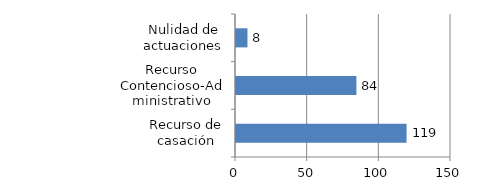
| Category | Series 0 |
|---|---|
| Recurso de casación | 119 |
| Recurso Contencioso-Administrativo | 84 |
| Nulidad de actuaciones | 8 |